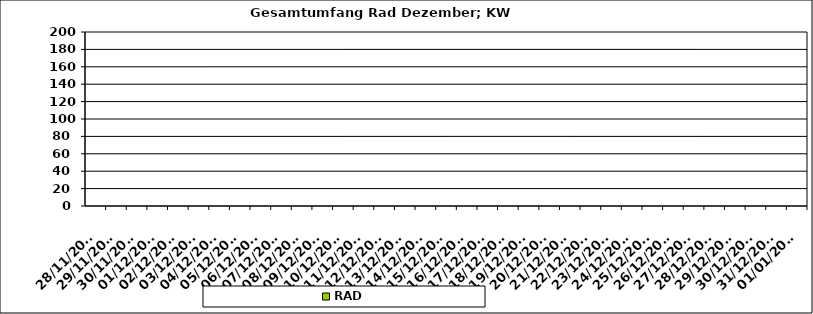
| Category | RAD |
|---|---|
| 28/11/2022 | 0 |
| 29/11/2022 | 0 |
| 30/11/2022 | 0 |
| 01/12/2022 | 0 |
| 02/12/2022 | 0 |
| 03/12/2022 | 0 |
| 04/12/2022 | 0 |
| 05/12/2022 | 0 |
| 06/12/2022 | 0 |
| 07/12/2022 | 0 |
| 08/12/2022 | 0 |
| 09/12/2022 | 0 |
| 10/12/2022 | 0 |
| 11/12/2022 | 0 |
| 12/12/2022 | 0 |
| 13/12/2022 | 0 |
| 14/12/2022 | 0 |
| 15/12/2022 | 0 |
| 16/12/2022 | 0 |
| 17/12/2022 | 0 |
| 18/12/2022 | 0 |
| 19/12/2022 | 0 |
| 20/12/2022 | 0 |
| 21/12/2022 | 0 |
| 22/12/2022 | 0 |
| 23/12/2022 | 0 |
| 24/12/2022 | 0 |
| 25/12/2022 | 0 |
| 26/12/2022 | 0 |
| 27/12/2022 | 0 |
| 28/12/2022 | 0 |
| 29/12/2022 | 0 |
| 30/12/2022 | 0 |
| 31/12/2022 | 0 |
| 01/01/2023 | 0 |